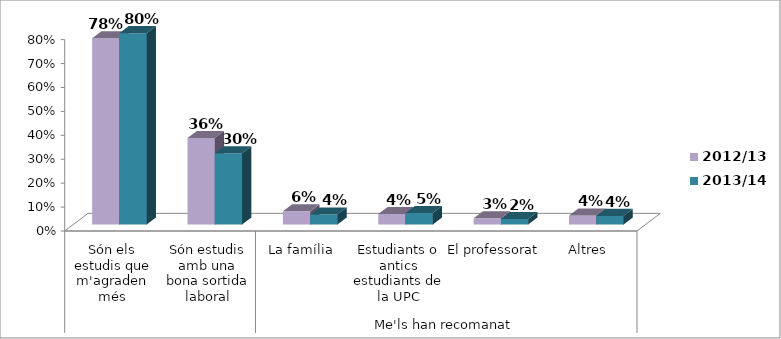
| Category | 2012/13 | 2013/14 |
|---|---|---|
| 0 | 0.779 | 0.8 |
| 1 | 0.362 | 0.298 |
| 2 | 0.055 | 0.042 |
| 3 | 0.044 | 0.048 |
| 4 | 0.026 | 0.023 |
| 5 | 0.038 | 0.036 |